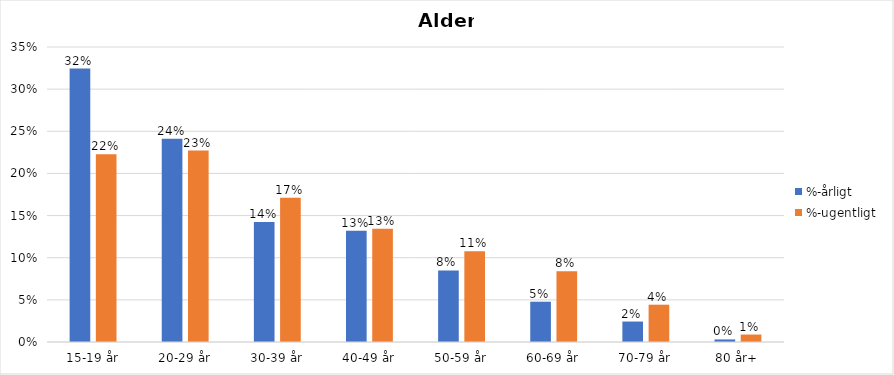
| Category | %-årligt | %-ugentligt |
|---|---|---|
| 15-19 år | 0.324 | 0.223 |
| 20-29 år | 0.241 | 0.227 |
| 30-39 år | 0.142 | 0.171 |
| 40-49 år | 0.132 | 0.134 |
| 50-59 år | 0.085 | 0.108 |
| 60-69 år | 0.048 | 0.084 |
| 70-79 år | 0.024 | 0.044 |
| 80 år+ | 0.003 | 0.009 |